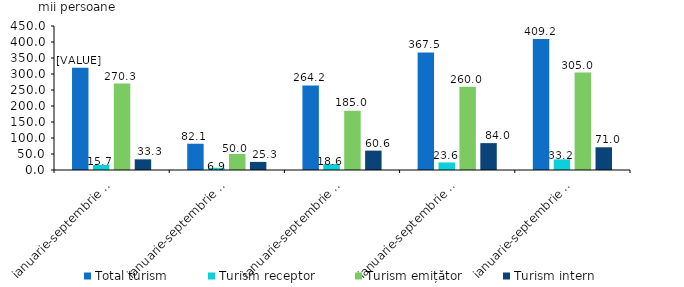
| Category | Total turism | Turism receptor | Turism emițător | Turism intern |
|---|---|---|---|---|
| ianuarie-septembrie 2019 | 319.2 | 15.7 | 270.3 | 33.3 |
| ianuarie-septembrie 2020 | 82.1 | 6.9 | 50 | 25.3 |
| ianuarie-septembrie 2021 | 264.2 | 18.6 | 185 | 60.6 |
| ianuarie-septembrie 2022 | 367.5 | 23.6 | 260 | 84 |
| ianuarie-septembrie 2023 | 409.2 | 33.2 | 305 | 71 |